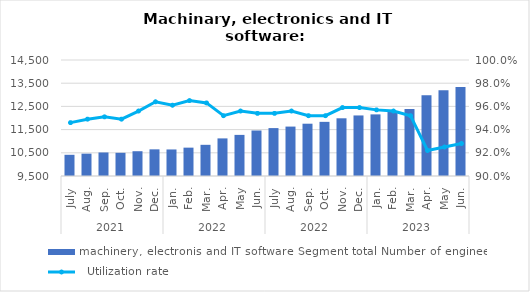
| Category | machinery, electronis and IT software |
|---|---|
| 0 | 10414 |
| 1 | 10463 |
| 2 | 10514 |
| 3 | 10500 |
| 4 | 10568 |
| 5 | 10649 |
| 6 | 10644 |
| 7 | 10722 |
| 8 | 10844 |
| 9 | 11121 |
| 10 | 11272 |
| 11 | 11461 |
| 12 | 11565 |
| 13 | 11630 |
| 14 | 11754 |
| 15 | 11834 |
| 16 | 11987 |
| 17 | 12110 |
| 18 | 12156 |
| 19 | 12289 |
| 20 | 12387 |
| 21 | 12981 |
| 22 | 13197 |
| 23 | 13338 |